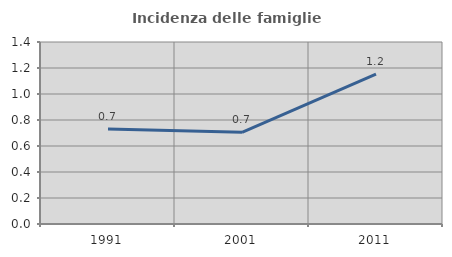
| Category | Incidenza delle famiglie numerose |
|---|---|
| 1991.0 | 0.731 |
| 2001.0 | 0.705 |
| 2011.0 | 1.152 |